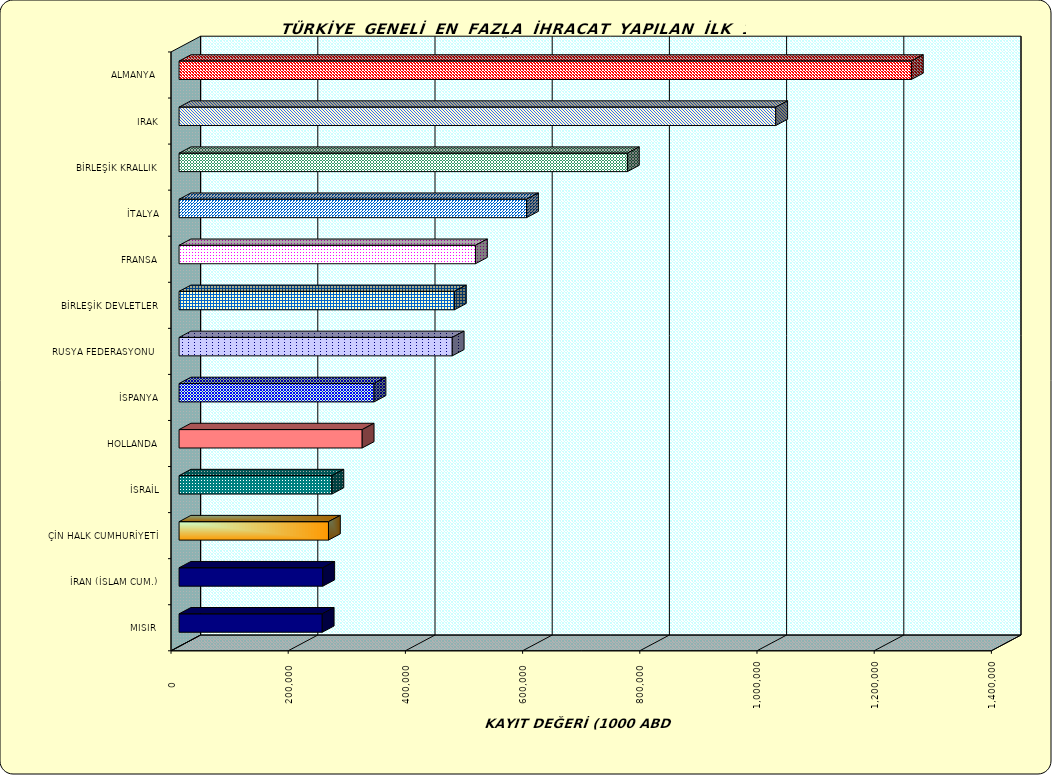
| Category | Series 0 |
|---|---|
| ALMANYA  | 1249743.6 |
| IRAK | 1018203.703 |
| BİRLEŞİK KRALLIK | 765077.094 |
| İTALYA | 592963.219 |
| FRANSA | 505819.751 |
| BİRLEŞİK DEVLETLER | 469892.138 |
| RUSYA FEDERASYONU  | 466153.817 |
| İSPANYA | 332661.7 |
| HOLLANDA | 312483.901 |
| İSRAİL | 260840.946 |
| ÇİN HALK CUMHURİYETİ | 254955.404 |
| İRAN (İSLAM CUM.) | 245219.319 |
| MISIR  | 244345.055 |